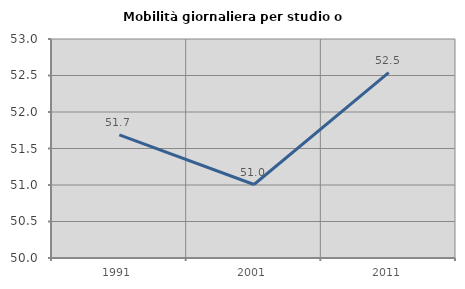
| Category | Mobilità giornaliera per studio o lavoro |
|---|---|
| 1991.0 | 51.685 |
| 2001.0 | 51.007 |
| 2011.0 | 52.538 |